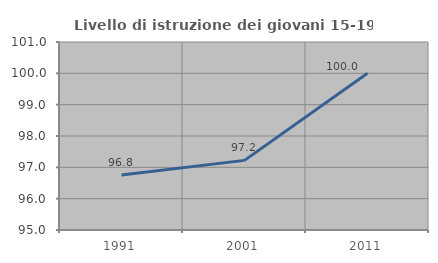
| Category | Livello di istruzione dei giovani 15-19 anni |
|---|---|
| 1991.0 | 96.753 |
| 2001.0 | 97.222 |
| 2011.0 | 100 |